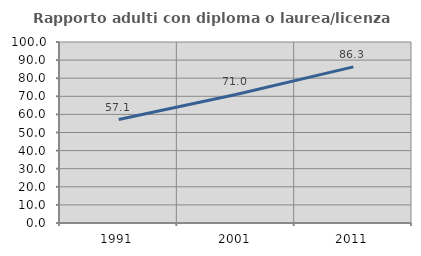
| Category | Rapporto adulti con diploma o laurea/licenza media  |
|---|---|
| 1991.0 | 57.143 |
| 2001.0 | 71.014 |
| 2011.0 | 86.26 |